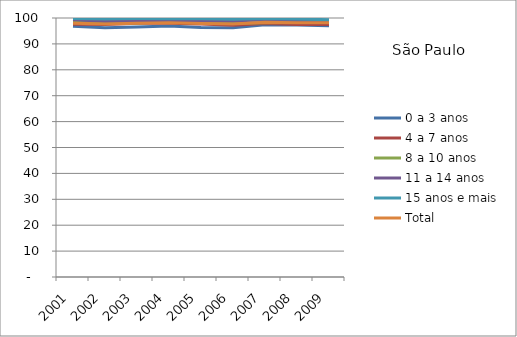
| Category | 0 a 3 anos | 4 a 7 anos | 8 a 10 anos | 11 a 14 anos | 15 anos e mais | Total |
|---|---|---|---|---|---|---|
| 2001.0 | 96.81 | 97.58 | 98.33 | 99.3 | 99.79 | 97.95 |
| 2002.0 | 96.26 | 97.53 | 98.24 | 98.79 | 99.62 | 97.67 |
| 2003.0 | 96.55 | 98.02 | 98.05 | 98.94 | 99.76 | 97.93 |
| 2004.0 | 96.95 | 98 | 98.56 | 99.05 | 99.67 | 98.15 |
| 2005.0 | 96.32 | 97.65 | 98.45 | 99.06 | 99.7 | 97.92 |
| 2006.0 | 96.26 | 97.21 | 97.93 | 98.85 | 99.52 | 97.71 |
| 2007.0 | 97.37 | 97.92 | 98.12 | 99.34 | 99.79 | 98.38 |
| 2008.0 | 97.32 | 97.49 | 98.28 | 98.82 | 99.65 | 98.14 |
| 2009.0 | 97.01 | 97.53 | 98.62 | 99.09 | 99.34 | 98.18 |